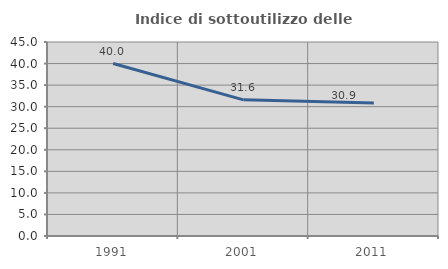
| Category | Indice di sottoutilizzo delle abitazioni  |
|---|---|
| 1991.0 | 40 |
| 2001.0 | 31.579 |
| 2011.0 | 30.859 |